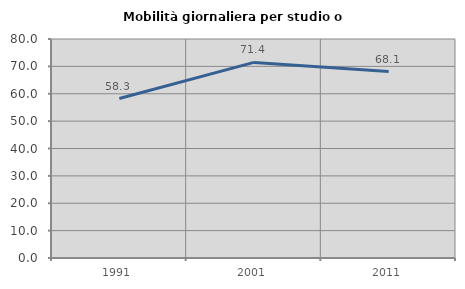
| Category | Mobilità giornaliera per studio o lavoro |
|---|---|
| 1991.0 | 58.256 |
| 2001.0 | 71.449 |
| 2011.0 | 68.094 |